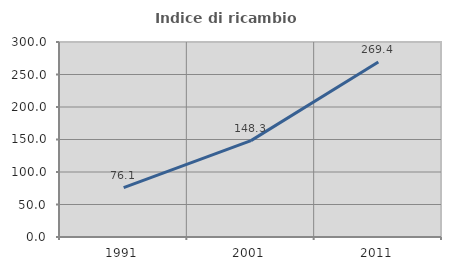
| Category | Indice di ricambio occupazionale  |
|---|---|
| 1991.0 | 76.07 |
| 2001.0 | 148.267 |
| 2011.0 | 269.364 |